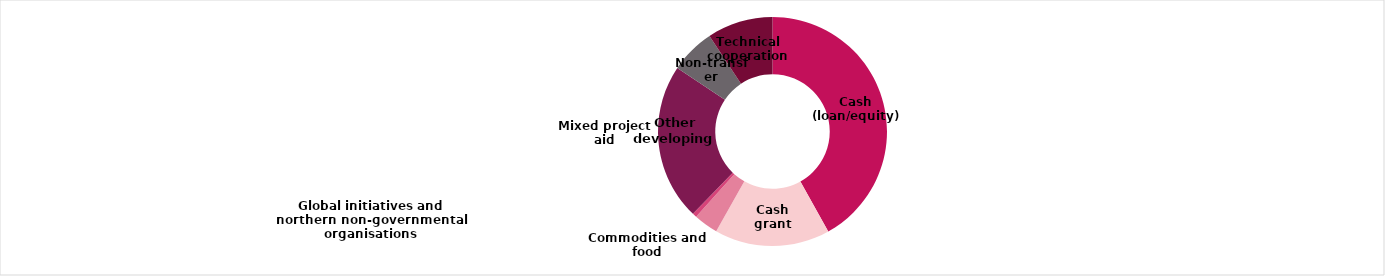
| Category | Series 0 |
|---|---|
| Cash (loan/equity) | 36601.171 |
| Cash grant | 14216.013 |
| Commodities and food | 3006.952 |
| Global initiatives and northern non-governmental organisations | 527.071 |
| Mixed project aid | 19340.747 |
| Non-transfer | 5549.449 |
| Technical cooperation | 8100.991 |